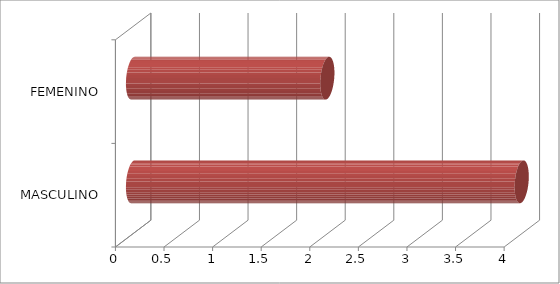
| Category | Series 0 |
|---|---|
| MASCULINO | 4 |
| FEMENINO | 2 |